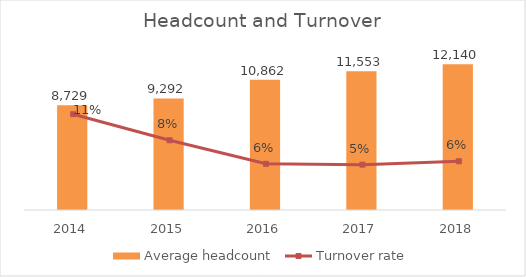
| Category | Average headcount |
|---|---|
| 2014.0 | 8729 |
| 2015.0 | 9292 |
| 2016.0 | 10862 |
| 2017.0 | 11553 |
| 2018.0 | 12140 |